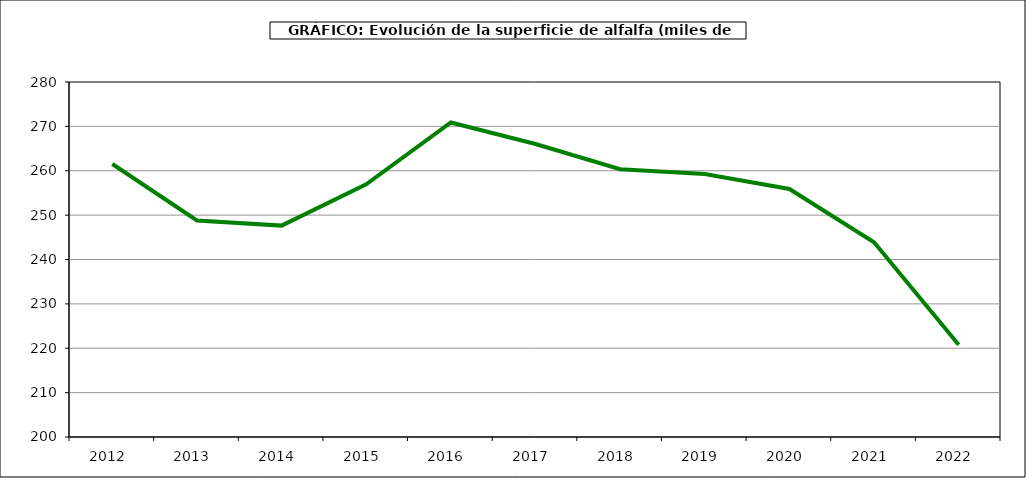
| Category | Superficie |
|---|---|
| 2012.0 | 261.526 |
| 2013.0 | 248.801 |
| 2014.0 | 247.639 |
| 2015.0 | 256.952 |
| 2016.0 | 270.874 |
| 2017.0 | 266.025 |
| 2018.0 | 260.337 |
| 2019.0 | 259.287 |
| 2020.0 | 255.89 |
| 2021.0 | 243.884 |
| 2022.0 | 220.789 |